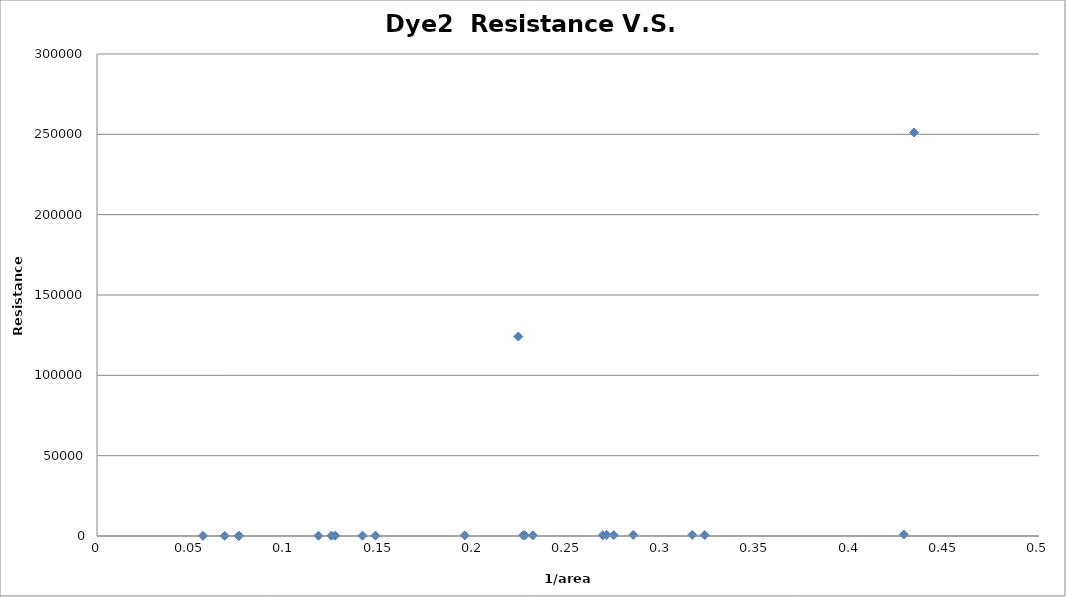
| Category | Series 0 |
|---|---|
| 0.31593580184506515 | 710.145 |
| 0.42822884549503254 | 916.84 |
| 0.4336889582791223 | 251125 |
| 0.27430326969497476 | 585.923 |
| 0.2313315443693902 | 441.95 |
| 0.32261186566441913 | 581.828 |
| 0.27056277056277056 | 638.205 |
| 0.2846326815244926 | 658.738 |
| 0.22616759018432653 | 463.34 |
| 0.19516003122560502 | 382.97 |
| 0.26846358291497757 | 464.359 |
| 0.22361859612245355 | 124169.852 |
| 0.22708692887637388 | 448.06 |
| 0.12439667612081405 | 197.795 |
| 0.11759310434036148 | 191.747 |
| 0.1409046075806679 | 210.904 |
| 0.14782840079236023 | 210.904 |
| 0.12640307412276267 | 197.795 |
| 0.06774149844194555 | 86.151 |
| 0.05625246104517073 | 73.109 |
| 0.07543298533582765 | 90.166 |
| 0.07512696457012351 | 89.162 |